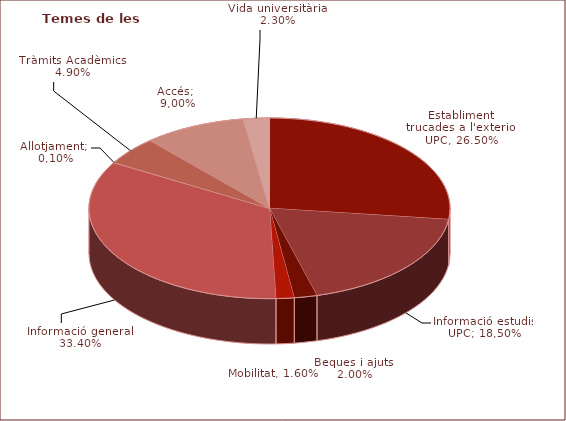
| Category | Series 0 |
|---|---|
| Establiment trucades a l'exterior UPC | 0.265 |
| Informació estudis UPC | 0.185 |
| Beques i ajuts | 0.02 |
| Mobilitat | 0.016 |
| Informació general | 0.334 |
| Allotjament | 0.001 |
| Tràmits Acadèmics | 0.049 |
| Accés | 0.09 |
| Vida universitària | 0.023 |